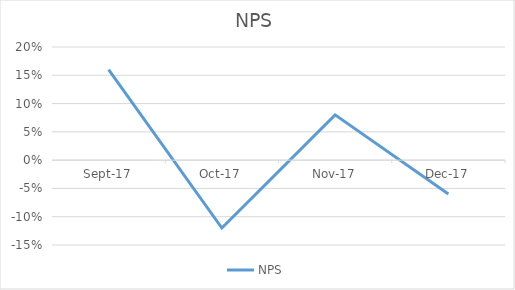
| Category | NPS |
|---|---|
| 2017-09-01 | 0.16 |
| 2017-10-01 | -0.12 |
| 2017-11-01 | 0.08 |
| 2017-12-01 | -0.06 |